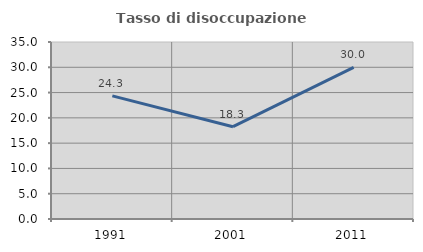
| Category | Tasso di disoccupazione giovanile  |
|---|---|
| 1991.0 | 24.35 |
| 2001.0 | 18.253 |
| 2011.0 | 29.977 |